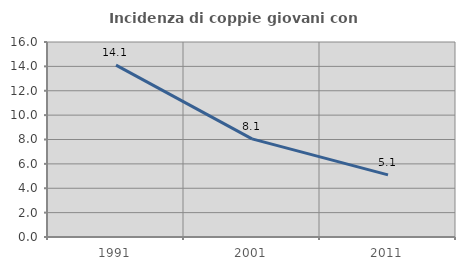
| Category | Incidenza di coppie giovani con figli |
|---|---|
| 1991.0 | 14.103 |
| 2001.0 | 8.051 |
| 2011.0 | 5.098 |